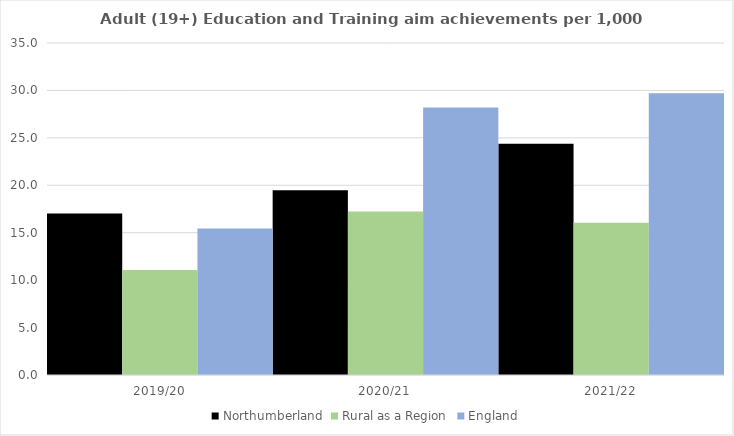
| Category | Northumberland | Rural as a Region | England |
|---|---|---|---|
| 2019/20 | 17.028 | 11.081 | 15.446 |
| 2020/21 | 19.482 | 17.224 | 28.211 |
| 2021/22 | 24.391 | 16.063 | 29.711 |